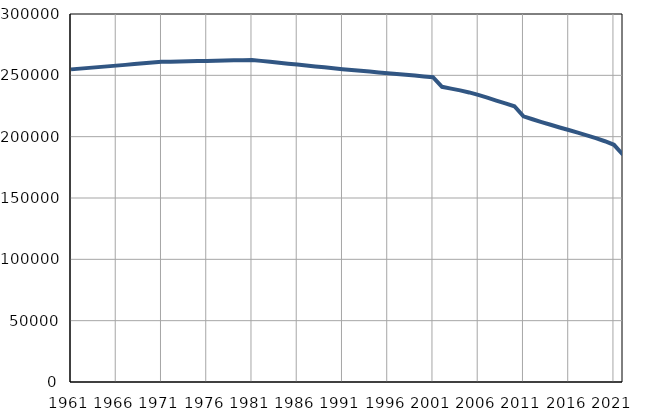
| Category | Број
становника |
|---|---|
| 1961.0 | 254855 |
| 1962.0 | 255468 |
| 1963.0 | 256080 |
| 1964.0 | 256693 |
| 1965.0 | 257306 |
| 1966.0 | 257919 |
| 1967.0 | 258531 |
| 1968.0 | 259144 |
| 1969.0 | 259757 |
| 1970.0 | 260369 |
| 1971.0 | 260982 |
| 1972.0 | 261137 |
| 1973.0 | 261292 |
| 1974.0 | 261447 |
| 1975.0 | 261602 |
| 1976.0 | 261757 |
| 1977.0 | 261911 |
| 1978.0 | 262066 |
| 1979.0 | 262221 |
| 1980.0 | 262376 |
| 1981.0 | 262531 |
| 1982.0 | 261779 |
| 1983.0 | 261027 |
| 1984.0 | 260275 |
| 1985.0 | 259523 |
| 1986.0 | 258771 |
| 1987.0 | 258019 |
| 1988.0 | 257267 |
| 1989.0 | 256515 |
| 1990.0 | 255763 |
| 1991.0 | 255011 |
| 1992.0 | 254359 |
| 1993.0 | 253706 |
| 1994.0 | 253054 |
| 1995.0 | 252401 |
| 1996.0 | 251749 |
| 1997.0 | 251096 |
| 1998.0 | 250444 |
| 1999.0 | 249791 |
| 2000.0 | 249139 |
| 2001.0 | 248486 |
| 2002.0 | 240642 |
| 2003.0 | 239181 |
| 2004.0 | 237765 |
| 2005.0 | 236062 |
| 2006.0 | 234018 |
| 2007.0 | 231793 |
| 2008.0 | 229430 |
| 2009.0 | 227116 |
| 2010.0 | 224776 |
| 2011.0 | 216583 |
| 2012.0 | 214184 |
| 2013.0 | 211890 |
| 2014.0 | 209691 |
| 2015.0 | 207500 |
| 2016.0 | 205400 |
| 2017.0 | 203254 |
| 2018.0 | 201024 |
| 2019.0 | 198740 |
| 2020.0 | 196265 |
| 2021.0 | 193364 |
| 2022.0 | 185301 |